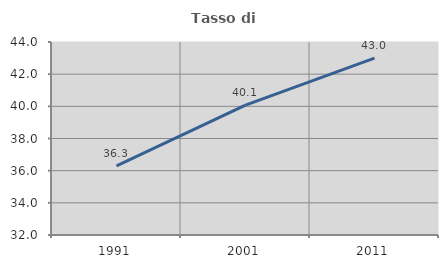
| Category | Tasso di occupazione   |
|---|---|
| 1991.0 | 36.303 |
| 2001.0 | 40.076 |
| 2011.0 | 42.999 |